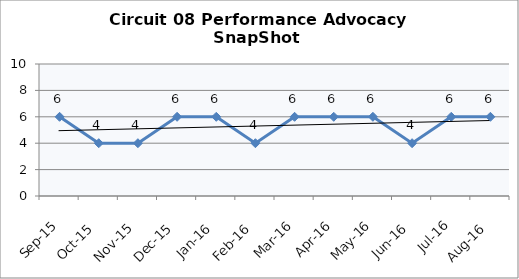
| Category | Circuit 08 |
|---|---|
| Sep-15 | 6 |
| Oct-15 | 4 |
| Nov-15 | 4 |
| Dec-15 | 6 |
| Jan-16 | 6 |
| Feb-16 | 4 |
| Mar-16 | 6 |
| Apr-16 | 6 |
| May-16 | 6 |
| Jun-16 | 4 |
| Jul-16 | 6 |
| Aug-16 | 6 |